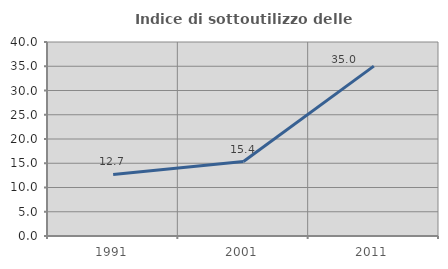
| Category | Indice di sottoutilizzo delle abitazioni  |
|---|---|
| 1991.0 | 12.704 |
| 2001.0 | 15.354 |
| 2011.0 | 35.033 |